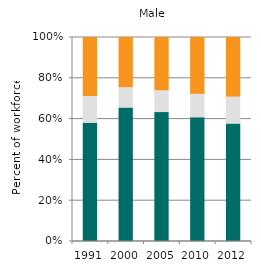
| Category | Agriculture | Industry | Services |
|---|---|---|---|
| 1991.0 | 58.023 | 13.04 | 28.937 |
| 2000.0 | 65.449 | 9.94 | 24.611 |
| 2005.0 | 63.188 | 10.664 | 26.149 |
| 2010.0 | 60.659 | 11.475 | 27.866 |
| 2012.0 | 57.592 | 13.158 | 29.249 |